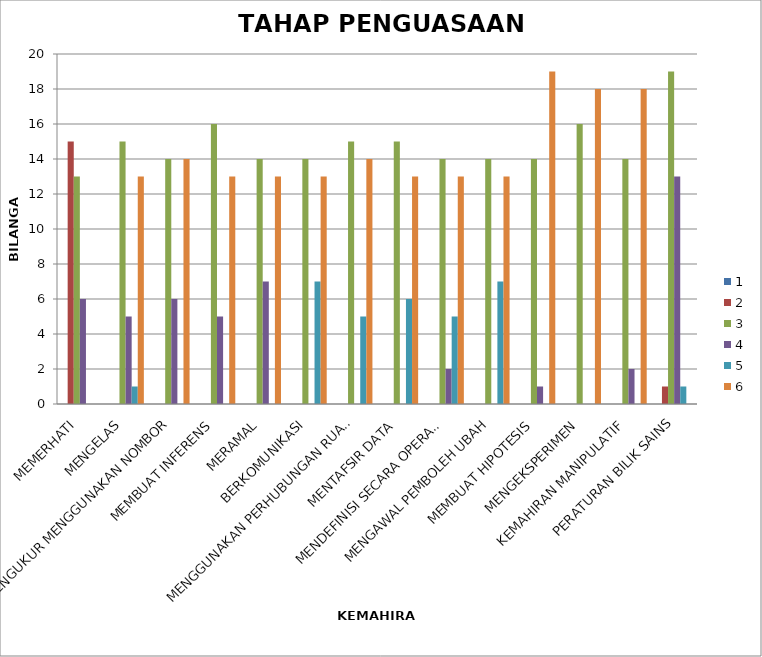
| Category | 1 | 2 | 3 | 4 | 5 | 6 |
|---|---|---|---|---|---|---|
| MEMERHATI | 0 | 15 | 13 | 6 | 0 | 0 |
| MENGELAS | 0 | 0 | 15 | 5 | 1 | 13 |
| MENGUKUR MENGGUNAKAN NOMBOR | 0 | 0 | 14 | 6 | 0 | 14 |
| MEMBUAT INFERENS | 0 | 0 | 16 | 5 | 0 | 13 |
| MERAMAL | 0 | 0 | 14 | 7 | 0 | 13 |
| BERKOMUNIKASI | 0 | 0 | 14 | 0 | 7 | 13 |
| MENGGUNAKAN PERHUBUNGAN RUANG DAN MASA | 0 | 0 | 15 | 0 | 5 | 14 |
| MENTAFSIR DATA | 0 | 0 | 15 | 0 | 6 | 13 |
| MENDEFINISI SECARA OPERASI | 0 | 0 | 14 | 2 | 5 | 13 |
| MENGAWAL PEMBOLEH UBAH | 0 | 0 | 14 | 0 | 7 | 13 |
| MEMBUAT HIPOTESIS | 0 | 0 | 14 | 1 | 0 | 19 |
| MENGEKSPERIMEN | 0 | 0 | 16 | 0 | 0 | 18 |
| KEMAHIRAN MANIPULATIF | 0 | 0 | 14 | 2 | 0 | 18 |
| PERATURAN BILIK SAINS | 0 | 1 | 19 | 13 | 1 | 0 |